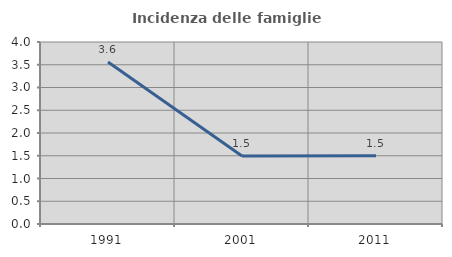
| Category | Incidenza delle famiglie numerose |
|---|---|
| 1991.0 | 3.562 |
| 2001.0 | 1.493 |
| 2011.0 | 1.502 |